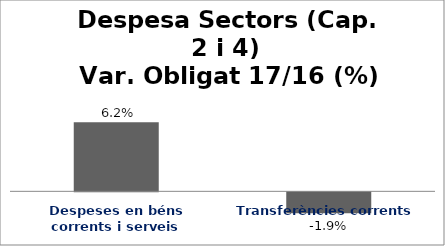
| Category | Series 0 |
|---|---|
| Despeses en béns corrents i serveis | 0.062 |
| Transferències corrents | -0.019 |